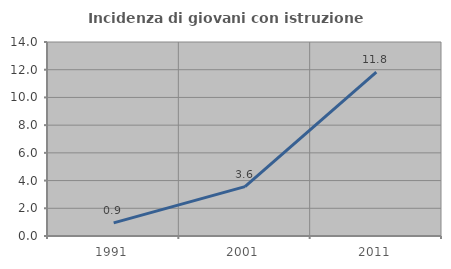
| Category | Incidenza di giovani con istruzione universitaria |
|---|---|
| 1991.0 | 0.949 |
| 2001.0 | 3.56 |
| 2011.0 | 11.832 |